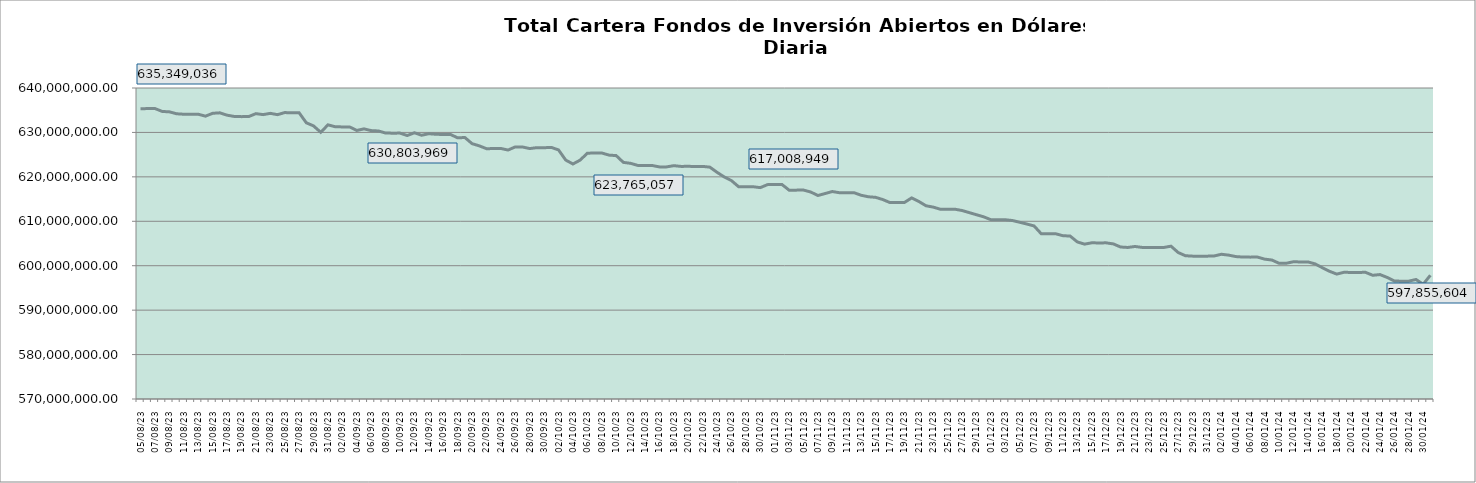
| Category | Cartera |
|---|---|
| 2023-08-05 | 635349036.46 |
| 2023-08-06 | 635361215.21 |
| 2023-08-07 | 635373397.99 |
| 2023-08-08 | 634725343.62 |
| 2023-08-09 | 634632191.17 |
| 2023-08-10 | 634198109.24 |
| 2023-08-11 | 634095578.51 |
| 2023-08-12 | 634084871.56 |
| 2023-08-13 | 634097754.61 |
| 2023-08-14 | 633660644.19 |
| 2023-08-15 | 634304579.71 |
| 2023-08-16 | 634411668.12 |
| 2023-08-17 | 633881462.91 |
| 2023-08-18 | 633598179.77 |
| 2023-08-19 | 633555008.39 |
| 2023-08-20 | 633569125.41 |
| 2023-08-21 | 634229115.27 |
| 2023-08-22 | 634008638.11 |
| 2023-08-23 | 634293770.16 |
| 2023-08-24 | 633997015.41 |
| 2023-08-25 | 634473548.38 |
| 2023-08-26 | 634403213.36 |
| 2023-08-27 | 634418246.72 |
| 2023-08-28 | 632165453.37 |
| 2023-08-29 | 631470956.36 |
| 2023-08-30 | 630024053.72 |
| 2023-08-31 | 631709657.36 |
| 2023-09-01 | 631281911.31 |
| 2023-09-02 | 631239874.72 |
| 2023-09-03 | 631241152.77 |
| 2023-09-04 | 630445632.35 |
| 2023-09-05 | 630803968.53 |
| 2023-09-06 | 630410162.07 |
| 2023-09-07 | 630328776.06 |
| 2023-09-08 | 629862871.91 |
| 2023-09-09 | 629834149.98 |
| 2023-09-10 | 629848710.38 |
| 2023-09-11 | 629302022.2 |
| 2023-09-12 | 629921438.88 |
| 2023-09-13 | 629369255.47 |
| 2023-09-14 | 629706943.49 |
| 2023-09-15 | 629586356.93 |
| 2023-09-16 | 629530597.95 |
| 2023-09-17 | 629546459.53 |
| 2023-09-18 | 628779780.99 |
| 2023-09-19 | 628861511.4 |
| 2023-09-20 | 627472168.54 |
| 2023-09-21 | 626981471.57 |
| 2023-09-22 | 626343530.21 |
| 2023-09-23 | 626365716.65 |
| 2023-09-24 | 626387077.26 |
| 2023-09-25 | 626035802.99 |
| 2023-09-26 | 626746486.02 |
| 2023-09-27 | 626727082.97 |
| 2023-09-28 | 626364911.59 |
| 2023-09-29 | 626577853.12 |
| 2023-09-30 | 626558294.54 |
| 2023-10-01 | 626630181.41 |
| 2023-10-02 | 626064064 |
| 2023-10-03 | 623776833.22 |
| 2023-10-04 | 622898490.48 |
| 2023-10-05 | 623765057.16 |
| 2023-10-06 | 625329398.49 |
| 2023-10-07 | 625357716.82 |
| 2023-10-08 | 625377076.92 |
| 2023-10-09 | 624895198.31 |
| 2023-10-10 | 624784848.21 |
| 2023-10-11 | 623258734.78 |
| 2023-10-12 | 623043383.61 |
| 2023-10-13 | 622575019.93 |
| 2023-10-14 | 622552964.89 |
| 2023-10-15 | 622558015.47 |
| 2023-10-16 | 622241454.37 |
| 2023-10-17 | 622245757.4 |
| 2023-10-18 | 622516652.22 |
| 2023-10-19 | 622353387.79 |
| 2023-10-20 | 622367994.78 |
| 2023-10-21 | 622338417.91 |
| 2023-10-22 | 622354218.29 |
| 2023-10-23 | 622185803.88 |
| 2023-10-24 | 621022062.92 |
| 2023-10-25 | 619977031.74 |
| 2023-10-26 | 619157040.59 |
| 2023-10-27 | 617769457.82 |
| 2023-10-28 | 617759539.98 |
| 2023-10-29 | 617777286.33 |
| 2023-10-30 | 617575557.56 |
| 2023-10-31 | 618250862.96 |
| 2023-11-01 | 618284254.62 |
| 2023-11-02 | 618295975.38 |
| 2023-11-03 | 617008948.58 |
| 2023-11-04 | 617012402.6 |
| 2023-11-05 | 617026032.4 |
| 2023-11-06 | 616588553.22 |
| 2023-11-07 | 615802234.9 |
| 2023-11-08 | 616245770.29 |
| 2023-11-09 | 616699385.57 |
| 2023-11-10 | 616428658.15 |
| 2023-11-11 | 616427509.43 |
| 2023-11-12 | 616441646.85 |
| 2023-11-13 | 615857000.56 |
| 2023-11-14 | 615518268.35 |
| 2023-11-15 | 615394438.58 |
| 2023-11-16 | 614891335.14 |
| 2023-11-17 | 614211343.69 |
| 2023-11-18 | 614213053.27 |
| 2023-11-19 | 614226265.49 |
| 2023-11-20 | 615260963.47 |
| 2023-11-21 | 614465100.72 |
| 2023-11-22 | 613490454.91 |
| 2023-11-23 | 613190306.71 |
| 2023-11-24 | 612707460.65 |
| 2023-11-25 | 612707964.31 |
| 2023-11-26 | 612721200.3 |
| 2023-11-27 | 612428100.64 |
| 2023-11-28 | 611950558.76 |
| 2023-11-29 | 611473435 |
| 2023-11-30 | 611009715.37 |
| 2023-12-01 | 610356615.3 |
| 2023-12-02 | 610328191.85 |
| 2023-12-03 | 610341715.72 |
| 2023-12-04 | 610172868.69 |
| 2023-12-05 | 609778742.97 |
| 2023-12-06 | 609380953.2 |
| 2023-12-07 | 608948882.46 |
| 2023-12-08 | 607178127.02 |
| 2023-12-09 | 607172032.52 |
| 2023-12-10 | 607193159.91 |
| 2023-12-11 | 606752180.93 |
| 2023-12-12 | 606678647.58 |
| 2023-12-13 | 605353047 |
| 2023-12-14 | 604857795.12 |
| 2023-12-15 | 605150551.68 |
| 2023-12-16 | 605131400.01 |
| 2023-12-17 | 605144731.96 |
| 2023-12-18 | 604908731.46 |
| 2023-12-19 | 604210080.8 |
| 2023-12-20 | 604109124.09 |
| 2023-12-21 | 604329531.01 |
| 2023-12-22 | 604116944.42 |
| 2023-12-23 | 604086319.41 |
| 2023-12-24 | 604094910.42 |
| 2023-12-25 | 604108041.63 |
| 2023-12-26 | 604396445.91 |
| 2023-12-27 | 602964873.52 |
| 2023-12-28 | 602248257.48 |
| 2023-12-29 | 602157295.01 |
| 2023-12-30 | 602137635.44 |
| 2023-12-31 | 602151330.27 |
| 2024-01-01 | 602201218.43 |
| 2024-01-02 | 602576952.32 |
| 2024-01-03 | 602381474.31 |
| 2024-01-04 | 602054617.98 |
| 2024-01-05 | 601947526.69 |
| 2024-01-06 | 601931607.8 |
| 2024-01-07 | 601944489.44 |
| 2024-01-08 | 601478248.59 |
| 2024-01-09 | 601282812.84 |
| 2024-01-10 | 600544837.33 |
| 2024-01-11 | 600557204.7 |
| 2024-01-12 | 600889570.58 |
| 2024-01-13 | 600845763.55 |
| 2024-01-14 | 600856275.91 |
| 2024-01-15 | 600409267.35 |
| 2024-01-16 | 599557557.91 |
| 2024-01-17 | 598747952.33 |
| 2024-01-18 | 598112799.15 |
| 2024-01-19 | 598520577.48 |
| 2024-01-20 | 598485353.47 |
| 2024-01-21 | 598495072.73 |
| 2024-01-22 | 598505218.44 |
| 2024-01-23 | 597842377.3 |
| 2024-01-24 | 598008339.17 |
| 2024-01-25 | 597360845.29 |
| 2024-01-26 | 596550990.07 |
| 2024-01-27 | 596519863.94 |
| 2024-01-28 | 596526824.75 |
| 2024-01-29 | 596899548.22 |
| 2024-01-30 | 595823189.54 |
| 2024-01-31 | 597855603.72 |